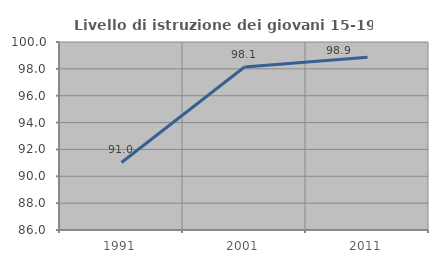
| Category | Livello di istruzione dei giovani 15-19 anni |
|---|---|
| 1991.0 | 91.027 |
| 2001.0 | 98.139 |
| 2011.0 | 98.856 |